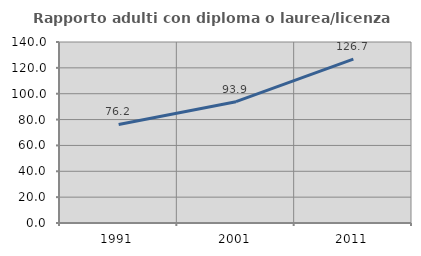
| Category | Rapporto adulti con diploma o laurea/licenza media  |
|---|---|
| 1991.0 | 76.197 |
| 2001.0 | 93.851 |
| 2011.0 | 126.706 |